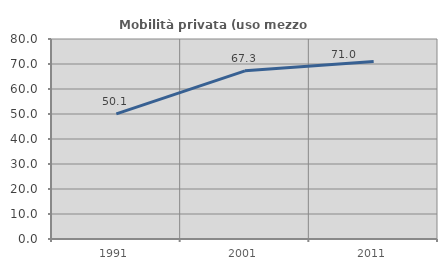
| Category | Mobilità privata (uso mezzo privato) |
|---|---|
| 1991.0 | 50.062 |
| 2001.0 | 67.252 |
| 2011.0 | 71.026 |